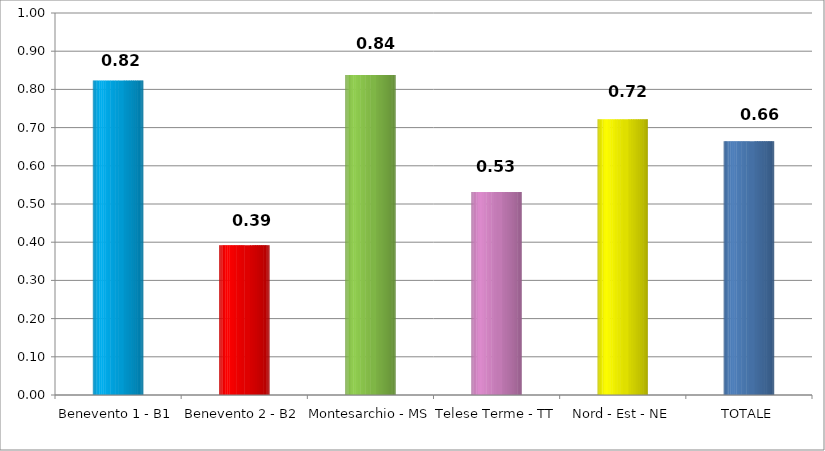
| Category | Series 0 |
|---|---|
| Benevento 1 - B1 | 0.823 |
| Benevento 2 - B2 | 0.392 |
| Montesarchio - MS | 0.838 |
| Telese Terme - TT | 0.531 |
| Nord - Est - NE | 0.722 |
| TOTALE | 0.665 |